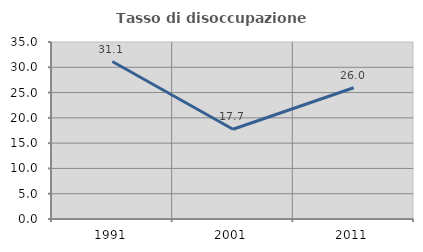
| Category | Tasso di disoccupazione giovanile  |
|---|---|
| 1991.0 | 31.143 |
| 2001.0 | 17.742 |
| 2011.0 | 25.954 |